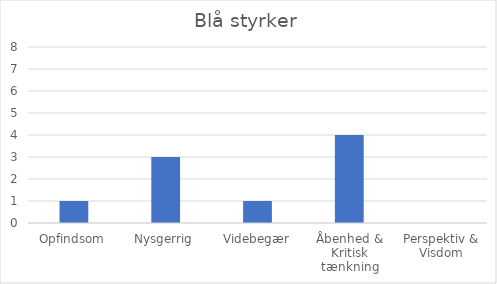
| Category | Series 0 |
|---|---|
| Opfindsom | 1 |
| Nysgerrig | 3 |
| Videbegær | 1 |
| Åbenhed & Kritisk tænkning | 4 |
| Perspektiv & Visdom | 0 |